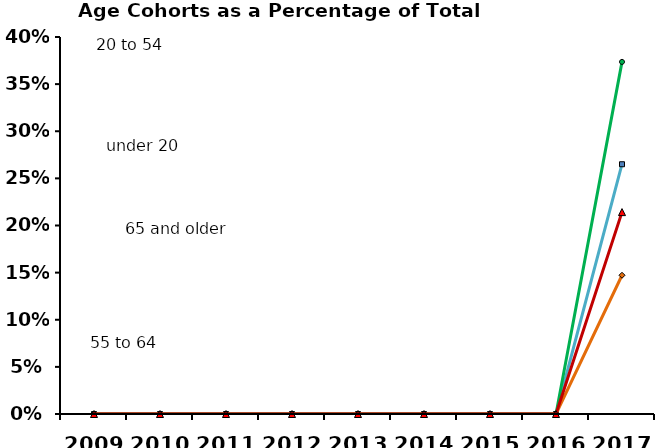
| Category | under 20 | 20 to 54 | 55 to 64 | 65 and older |
|---|---|---|---|---|
| 0 | 0 | 0 | 0 | 0 |
| 1 | 0 | 0 | 0 | 0 |
| 2 | 0 | 0 | 0 | 0 |
| 3 | 0 | 0 | 0 | 0 |
| 4 | 0 | 0 | 0 | 0 |
| 5 | 0 | 0 | 0 | 0 |
| 6 | 0 | 0 | 0 | 0 |
| 7 | 0 | 0 | 0 | 0 |
| 8 | 0.265 | 0.374 | 0.147 | 0.214 |